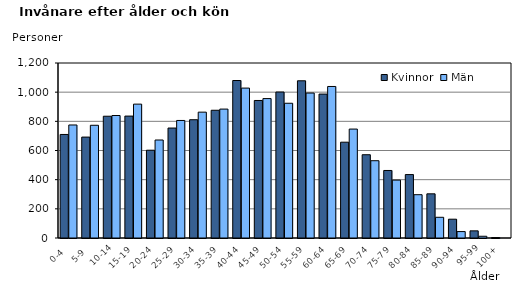
| Category | Kvinnor | Män |
|---|---|---|
|   0-4  | 710 | 775 |
|   5-9  | 692 | 773 |
| 10-14 | 835 | 840 |
| 15-19  | 836 | 918 |
| 20-24  | 602 | 672 |
| 25-29  | 754 | 806 |
| 30-34  | 811 | 863 |
| 35-39  | 876 | 884 |
| 40-44  | 1080 | 1028 |
| 45-49  | 943 | 956 |
| 50-54  | 1001 | 924 |
| 55-59  | 1078 | 994 |
| 60-64  | 987 | 1039 |
| 65-69  | 657 | 747 |
| 70-74  | 571 | 530 |
| 75-79  | 463 | 397 |
| 80-84  | 435 | 297 |
| 85-89  | 303 | 142 |
| 90-94  | 129 | 44 |
| 95-99 | 49 | 12 |
| 100+ | 3 | 0 |